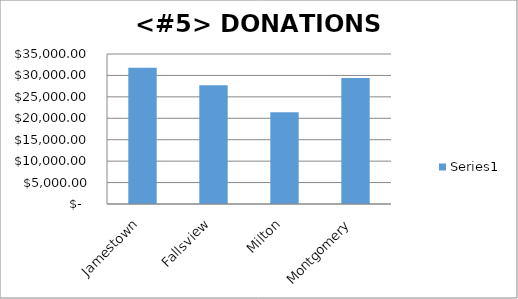
| Category | Series 0 |
|---|---|
| Jamestown | 31800 |
| Fallsview | 27700 |
| Milton | 21400 |
| Montgomery | 29400 |